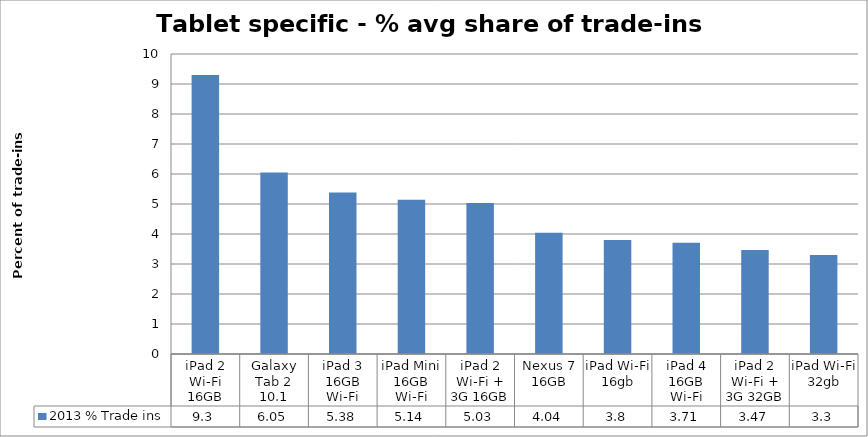
| Category | 2013 % Trade ins  |
|---|---|
| iPad 2 Wi-Fi 16GB | 9.3 |
| Galaxy Tab 2 10.1 | 6.05 |
| iPad 3 16GB Wi-Fi | 5.38 |
| iPad Mini 16GB Wi-Fi | 5.14 |
| iPad 2 Wi-Fi + 3G 16GB | 5.03 |
| Nexus 7 16GB | 4.04 |
| iPad Wi-Fi 16gb | 3.8 |
| iPad 4 16GB Wi-Fi | 3.71 |
| iPad 2 Wi-Fi + 3G 32GB | 3.47 |
| iPad Wi-Fi 32gb | 3.3 |